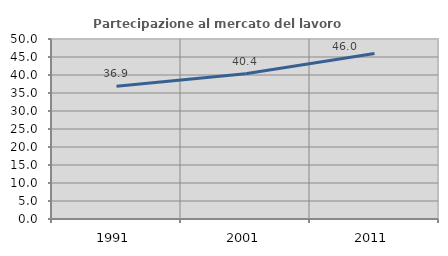
| Category | Partecipazione al mercato del lavoro  femminile |
|---|---|
| 1991.0 | 36.903 |
| 2001.0 | 40.364 |
| 2011.0 | 45.956 |